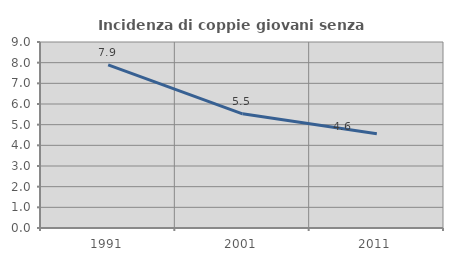
| Category | Incidenza di coppie giovani senza figli |
|---|---|
| 1991.0 | 7.895 |
| 2001.0 | 5.524 |
| 2011.0 | 4.56 |